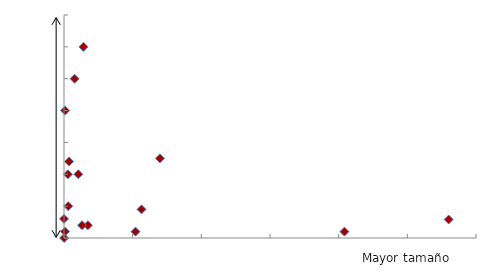
| Category | Inclusión y tamaño de la entidad |
|---|---|
| 0.1910377139169351 | 0.17 |
| 0.13594316749121968 | 0.002 |
| 0.00565387158077828 | 0.3 |
| 0.14896141968406135 | 0.638 |
| 0.11204889401290055 | 0.029 |
| 0.08167762917482968 | 0.01 |
| 0.006963182764536262 | 0.02 |
| 0.0002967444227066404 | 0.01 |
| 0.00033986795157020045 | 0.2 |
| 0.001146542138583127 | 0.1 |
| 3.349716562691852e-05 | 0 |
| 0.0012109368524411501 | 0.05 |
| 0.022584433111778286 | 0.045 |
| 0.04468184076820703 | 0.497 |
| 0.001089230806886452 | 0.6 |
| 1.01712850492805e-05 | 0.03 |
| 0.004179988189341968 | 0.1 |
| 0.0014862434718158923 | 0.12 |
| 0.005244568868136586 | 0.02 |
| 0.11727291542062926 | 0.49 |
| 0.003085380853808399 | 0.25 |
| 0.027934536380086236 | 0.125 |
| 0.020828063041691377 | 0.01 |
| 0.01196736344619824 | 0.7 |